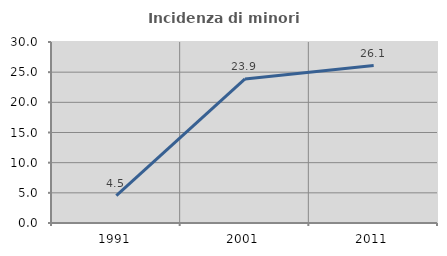
| Category | Incidenza di minori stranieri |
|---|---|
| 1991.0 | 4.545 |
| 2001.0 | 23.887 |
| 2011.0 | 26.1 |